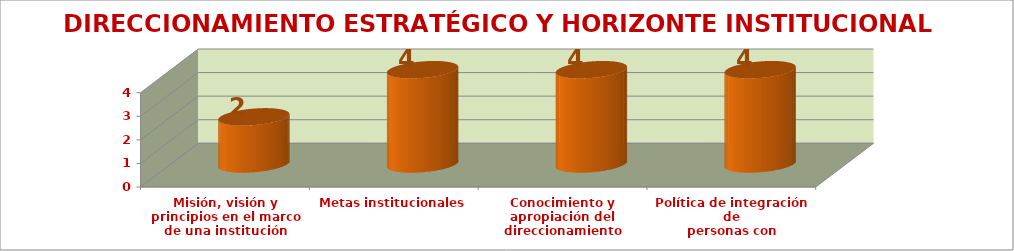
| Category | DIRECCIONAMIENTO ESTRATÉGICO Y HORIZONTE INSTITUCIONAL |
|---|---|
| Misión, visión y principios en el marco de una institución
integrada | 2 |
| Metas institucionales | 4 |
| Conocimiento y apropiación del direccionamiento | 4 |
| Política de integración de
personas con capacidades
disímiles o diversidad cultural | 4 |